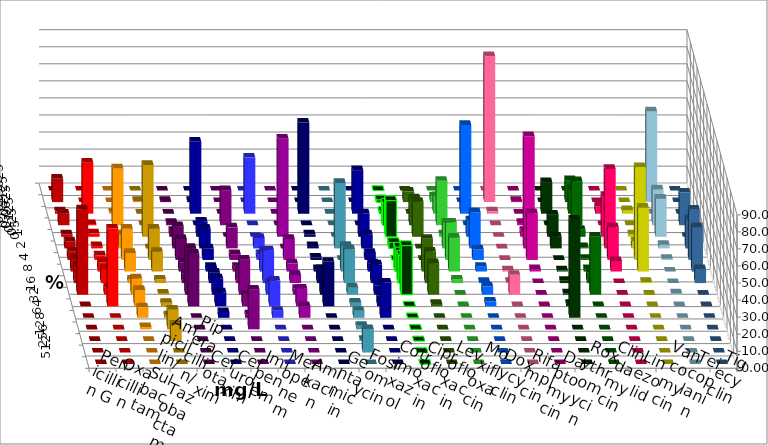
| Category | Penicillin G | Oxacillin | Ampicillin/ Sulbactam | Piperacillin/ Tazobactam | Cefotaxim | Cefuroxim | Imipenem | Meropenem | Amikacin | Gentamicin | Fosfomycin | Cotrimoxazol | Ciprofloxacin | Levofloxacin | Moxifloxacin | Doxycyclin | Rifampicin | Daptomycin | Roxythromycin | Clindamycin | Linezolid | Vancomycin | Teicoplanin | Tigecyclin |
|---|---|---|---|---|---|---|---|---|---|---|---|---|---|---|---|---|---|---|---|---|---|---|---|---|
| 0.015625 | 0 | 0 | 0 | 0 | 0 | 0 | 0 | 0 | 0 | 0 | 0 | 0 | 0 | 0 | 0 | 0 | 0 | 0 | 0 | 0 | 0 | 0 | 0 | 0 |
| 0.03125 | 13.699 | 0 | 0 | 0.68 | 0.685 | 0 | 0.68 | 0 | 0 | 0 | 0 | 0 | 1.37 | 6.164 | 3.425 | 0 | 85.616 | 0.685 | 0 | 12.925 | 0 | 0 | 0 | 53.147 |
| 0.0625 | 1.37 | 29.932 | 0.68 | 0 | 0 | 0 | 42.177 | 32.877 | 0 | 53.425 | 0 | 25.517 | 1.37 | 0 | 10.274 | 52.055 | 1.37 | 0 | 18.493 | 14.286 | 4.11 | 2.041 | 0 | 0 |
| 0.125 | 6.849 | 0.68 | 33.333 | 0 | 1.37 | 20.548 | 0 | 0 | 0 | 0 | 0 | 0 | 13.014 | 15.753 | 26.027 | 0 | 0 | 1.37 | 0 | 25.85 | 0 | 0 | 19.178 | 20.979 |
| 0.25 | 1.37 | 2.041 | 0 | 42.177 | 3.425 | 0 | 8.844 | 0 | 57.534 | 1.37 | 0 | 13.793 | 21.233 | 20.548 | 1.37 | 9.589 | 0 | 3.425 | 13.014 | 4.082 | 23.973 | 1.361 | 0 | 22.378 |
| 0.5 | 4.11 | 1.361 | 8.163 | 0 | 13.014 | 12.329 | 11.565 | 6.164 | 0 | 1.37 | 38.356 | 8.276 | 3.425 | 0 | 15.068 | 21.233 | 0 | 65.753 | 6.849 | 0.68 | 46.575 | 4.082 | 17.123 | 2.098 |
| 1.0 | 4.795 | 2.721 | 18.367 | 18.367 | 12.329 | 3.425 | 6.803 | 3.425 | 12.329 | 1.37 | 0 | 4.138 | 0 | 0 | 21.918 | 6.164 | 0 | 27.397 | 0 | 0.68 | 19.178 | 54.422 | 29.452 | 0.699 |
| 2.0 | 7.534 | 5.442 | 10.884 | 11.565 | 5.479 | 2.74 | 2.721 | 12.329 | 4.795 | 1.37 | 15.068 | 4.828 | 14.384 | 19.178 | 19.863 | 2.74 | 0.685 | 1.37 | 0.685 | 1.361 | 6.164 | 37.415 | 26.027 | 0 |
| 4.0 | 10.274 | 8.163 | 2.041 | 2.041 | 5.479 | 8.219 | 6.122 | 19.178 | 4.795 | 8.219 | 19.863 | 11.034 | 16.438 | 18.493 | 2.055 | 0.685 | 0.685 | 0 | 1.37 | 6.122 | 0 | 0.68 | 8.219 | 0 |
| 8.0 | 50 | 4.082 | 9.524 | 0.68 | 27.397 | 20.548 | 9.524 | 6.849 | 3.425 | 6.849 | 4.11 | 5.517 | 28.767 | 18.493 | 0 | 4.795 | 11.644 | 0 | 0.685 | 34.014 | 0 | 0 | 0 | 0.699 |
| 16.0 | 0 | 45.578 | 9.524 | 2.041 | 30.822 | 6.849 | 8.163 | 15.068 | 10.274 | 26.027 | 2.055 | 6.207 | 0 | 1.37 | 0 | 2.74 | 0 | 0 | 1.37 | 0 | 0 | 0 | 0 | 0 |
| 32.0 | 0 | 0 | 6.122 | 1.361 | 0 | 2.055 | 3.401 | 4.11 | 6.849 | 0 | 4.11 | 20.69 | 0 | 0 | 0 | 0 | 0 | 0 | 57.534 | 0 | 0 | 0 | 0 | 0 |
| 64.0 | 0 | 0 | 1.361 | 11.565 | 0 | 23.288 | 0 | 0 | 0 | 0 | 2.055 | 0 | 0 | 0 | 0 | 0 | 0 | 0 | 0 | 0 | 0 | 0 | 0 | 0 |
| 128.0 | 0 | 0 | 0 | 9.524 | 0 | 0 | 0 | 0 | 0 | 0 | 0.685 | 0 | 0 | 0 | 0 | 0 | 0 | 0 | 0 | 0 | 0 | 0 | 0 | 0 |
| 256.0 | 0 | 0 | 0 | 0 | 0 | 0 | 0 | 0 | 0 | 0 | 13.699 | 0 | 0 | 0 | 0 | 0 | 0 | 0 | 0 | 0 | 0 | 0 | 0 | 0 |
| 512.0 | 0 | 0 | 0 | 0 | 0 | 0 | 0 | 0 | 0 | 0 | 0 | 0 | 0 | 0 | 0 | 0 | 0 | 0 | 0 | 0 | 0 | 0 | 0 | 0 |